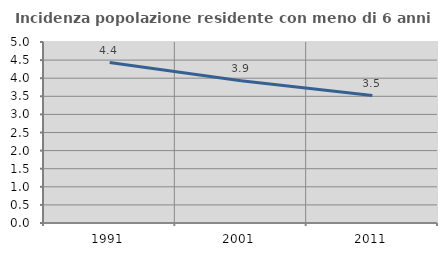
| Category | Incidenza popolazione residente con meno di 6 anni |
|---|---|
| 1991.0 | 4.431 |
| 2001.0 | 3.929 |
| 2011.0 | 3.522 |